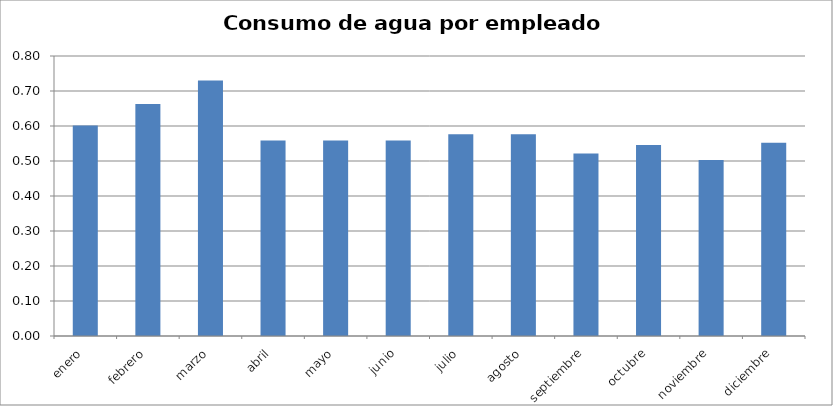
| Category | Series 0 |
|---|---|
| enero | 0.601 |
| febrero | 0.663 |
| marzo | 0.73 |
| abril | 0.558 |
| mayo | 0.558 |
| junio | 0.558 |
| julio | 0.577 |
| agosto | 0.577 |
| septiembre | 0.521 |
| octubre | 0.546 |
| noviembre | 0.503 |
| diciembre | 0.552 |